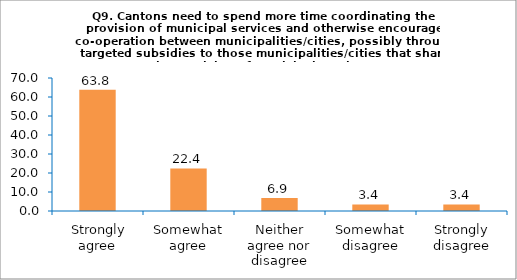
| Category | Series 0 |
|---|---|
|  Strongly agree | 63.793 |
| Somewhat agree | 22.414 |
| Neither agree nor disagree | 6.897 |
| Somewhat disagree | 3.448 |
| Strongly disagree | 3.448 |